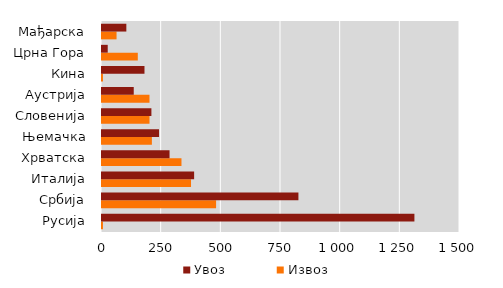
| Category | Извоз | Увоз |
|---|---|---|
| Русија | 4 | 1309 |
| Србија | 478 | 823 |
| Италија | 373 | 386 |
| Хрватска | 333 | 283 |
| Њемачка | 209 | 239 |
| Словенија | 199 | 207 |
| Аустрија | 199 | 133 |
| Кина | 4 | 178 |
| Црна Гора | 150 | 24 |
| Мађарска | 61 | 102 |